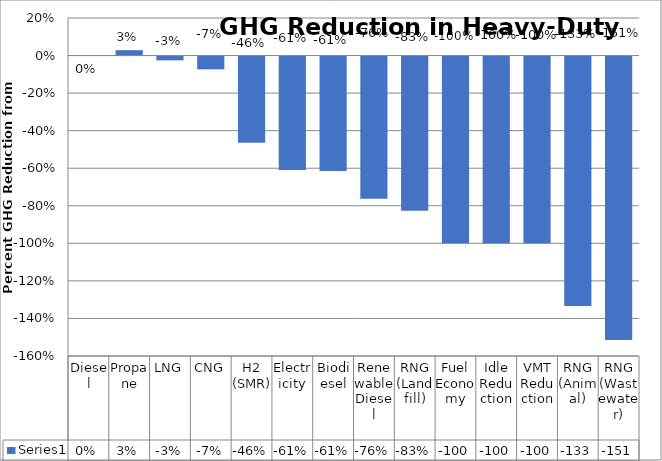
| Category | Series 0 |
|---|---|
| Diesel | 0 |
| Propane | 0.029 |
| LNG | -0.026 |
| CNG | -0.073 |
| H2 (SMR) | -0.464 |
| Electricity | -0.61 |
| Biodiesel | -0.615 |
| Renewable Diesel | -0.763 |
| RNG (Landfill) | -0.826 |
| Fuel Economy | -1 |
| Idle Reduction | -1 |
| VMT Reduction | -1 |
| RNG (Animal) | -1.334 |
| RNG (Wastewater) | -1.514 |